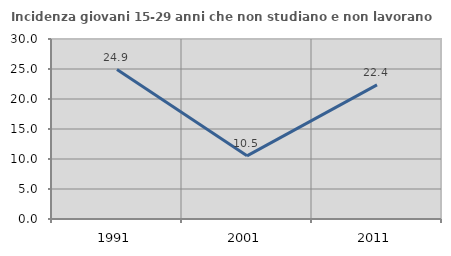
| Category | Incidenza giovani 15-29 anni che non studiano e non lavorano  |
|---|---|
| 1991.0 | 24.91 |
| 2001.0 | 10.526 |
| 2011.0 | 22.353 |